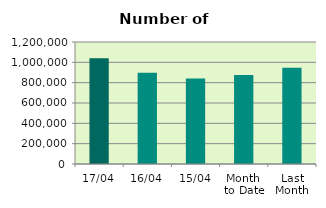
| Category | Series 0 |
|---|---|
| 17/04 | 1041132 |
| 16/04 | 898614 |
| 15/04 | 840424 |
| Month 
to Date | 875119.846 |
| Last
Month | 947588.19 |